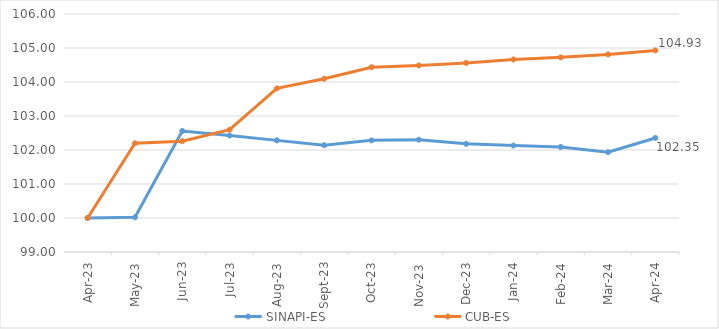
| Category | SINAPI-ES | CUB-ES |
|---|---|---|
| 2023-04-01 | 100 | 100 |
| 2023-05-01 | 100.02 | 102.198 |
| 2023-06-01 | 102.56 | 102.26 |
| 2023-07-01 | 102.427 | 102.599 |
| 2023-08-01 | 102.283 | 103.812 |
| 2023-09-01 | 102.141 | 104.095 |
| 2023-10-01 | 102.283 | 104.436 |
| 2023-11-01 | 102.304 | 104.488 |
| 2023-12-01 | 102.181 | 104.562 |
| 2024-01-01 | 102.13 | 104.663 |
| 2024-02-01 | 102.09 | 104.725 |
| 2024-03-01 | 101.936 | 104.811 |
| 2024-04-01 | 102.354 | 104.93 |